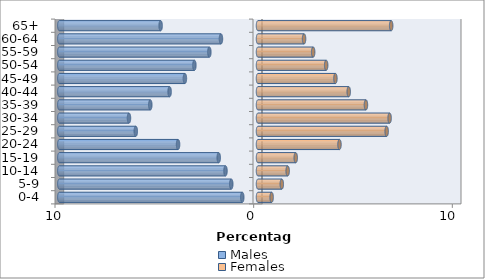
| Category | Males | Females |
|---|---|---|
| 0-4 | -0.792 | 0.686 |
| 5-9 | -1.346 | 1.198 |
| 10-14 | -1.637 | 1.493 |
| 15-19 | -1.977 | 1.899 |
| 20-24 | -4.024 | 4.102 |
| 25-29 | -6.152 | 6.476 |
| 30-34 | -6.495 | 6.625 |
| 35-39 | -5.422 | 5.433 |
| 40-44 | -4.449 | 4.567 |
| 45-49 | -3.68 | 3.897 |
| 50-54 | -3.202 | 3.432 |
| 55-59 | -2.449 | 2.777 |
| 60-64 | -1.865 | 2.319 |
| 65+ | -4.902 | 6.704 |